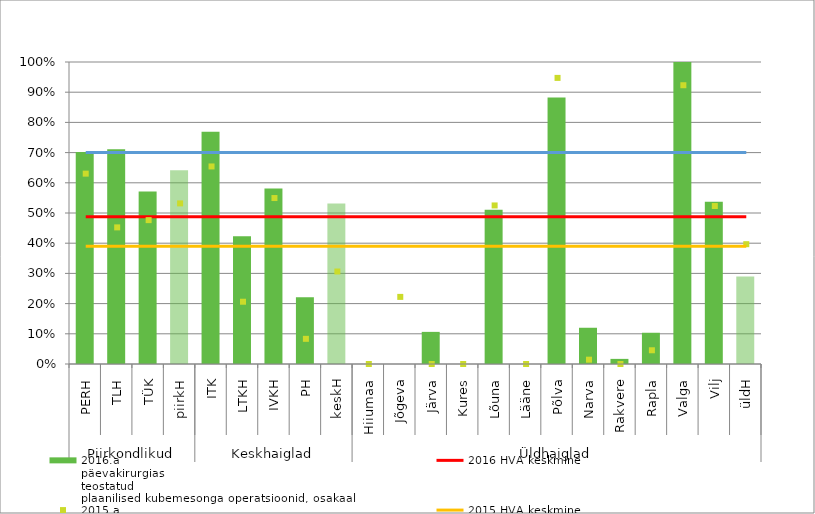
| Category | 2016.a
päevakirurgias
teostatud
plaanilised kubemesonga operatsioonid, osakaal |
|---|---|
| 0 | 0.702 |
| 1 | 0.711 |
| 2 | 0.571 |
| 3 | 0.642 |
| 4 | 0.769 |
| 5 | 0.423 |
| 6 | 0.581 |
| 7 | 0.221 |
| 8 | 0.532 |
| 9 | 0 |
| 10 | 0 |
| 11 | 0.106 |
| 12 | 0 |
| 13 | 0.511 |
| 14 | 0 |
| 15 | 0.882 |
| 16 | 0.12 |
| 17 | 0.017 |
| 18 | 0.103 |
| 19 | 1 |
| 20 | 0.537 |
| 21 | 0.29 |